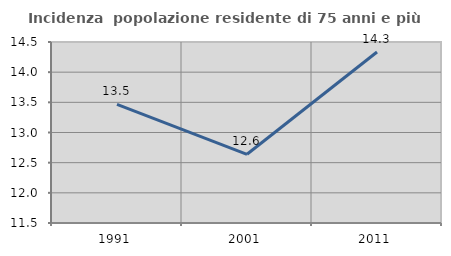
| Category | Incidenza  popolazione residente di 75 anni e più |
|---|---|
| 1991.0 | 13.466 |
| 2001.0 | 12.639 |
| 2011.0 | 14.334 |